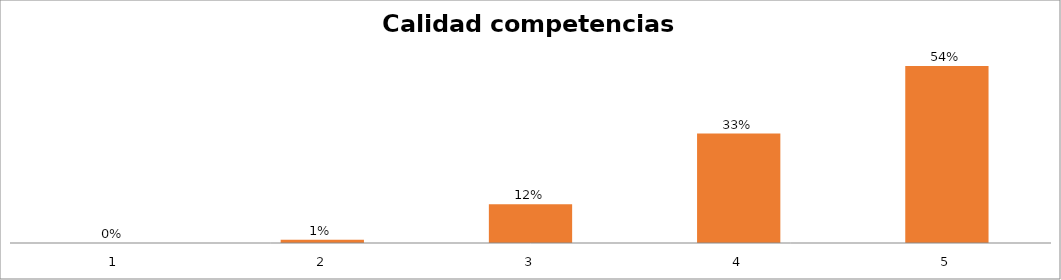
| Category | Series 1 |
|---|---|
| 0 | 0 |
| 1 | 0.01 |
| 2 | 0.118 |
| 3 | 0.333 |
| 4 | 0.539 |